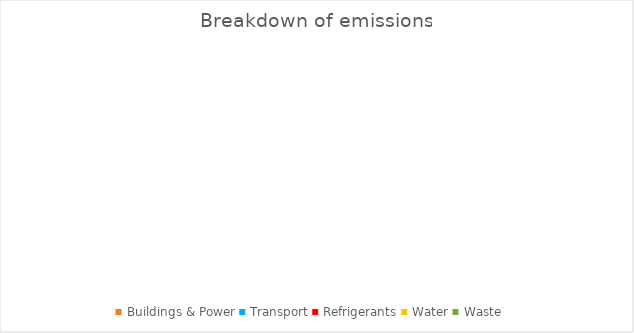
| Category | Series 0 |
|---|---|
| Buildings & Power | 0 |
| Transport | 0 |
| Refrigerants | 0 |
| Water | 0 |
| Waste | 0 |